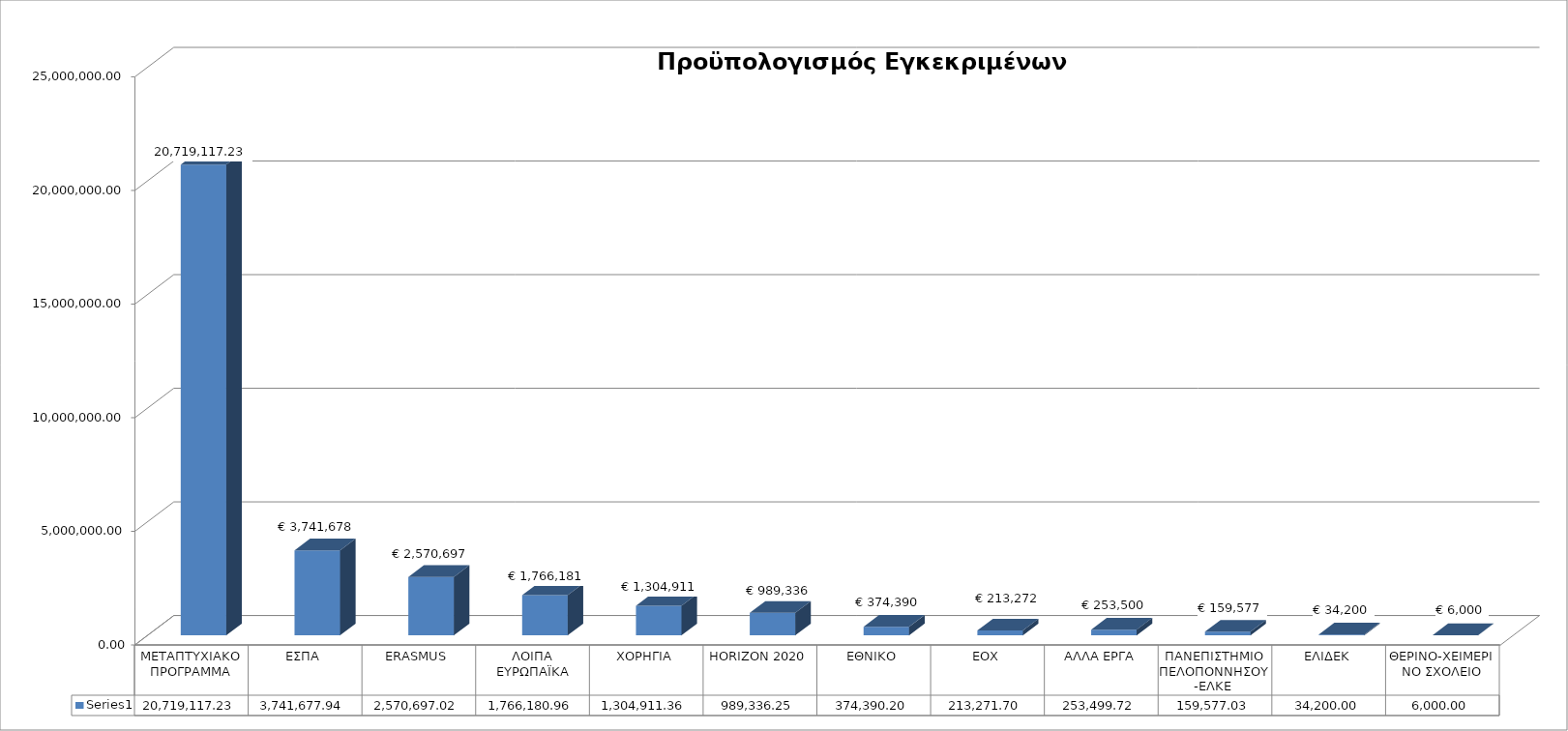
| Category | Series 0 |
|---|---|
| ΜΕΤΑΠΤΥΧΙΑΚΟ ΠΡΟΓΡΑΜΜΑ | 20719117.23 |
| ΕΣΠΑ | 3741677.94 |
| ERASMUS | 2570697.02 |
| ΛΟΙΠΑ ΕΥΡΩΠΑΪΚΑ | 1766180.96 |
| ΧΟΡΗΓΙΑ | 1304911.36 |
| HORIZON 2020 | 989336.25 |
| ΕΘΝΙΚΟ | 374390.2 |
| ΕΟΧ | 213271.7 |
| ΑΛΛΑ ΕΡΓΑ | 253499.72 |
| ΠΑΝΕΠΙΣΤΗΜΙΟ ΠΕΛΟΠΟΝΝΗΣΟΥ -ΕΛΚΕ  | 159577.03 |
| ΕΛΙΔΕΚ | 34200 |
| ΘΕΡΙΝΟ-ΧΕΙΜΕΡΙΝΟ ΣΧΟΛΕΙΟ | 6000 |